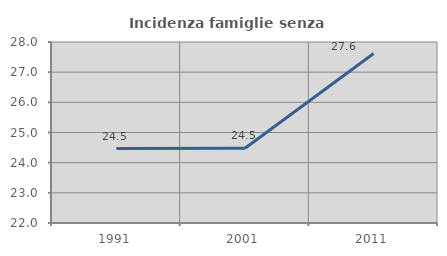
| Category | Incidenza famiglie senza nuclei |
|---|---|
| 1991.0 | 24.468 |
| 2001.0 | 24.477 |
| 2011.0 | 27.619 |